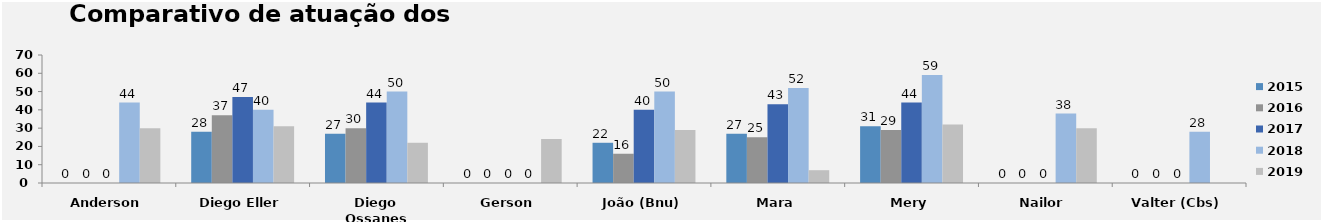
| Category | 2015 | 2016 | 2017 | 2018 | 2019 |
|---|---|---|---|---|---|
| Anderson | 0 | 0 | 0 | 44 | 30 |
| Diego Eller | 28 | 37 | 47 | 40 | 31 |
| Diego Ossanes | 27 | 30 | 44 | 50 | 22 |
| Gerson | 0 | 0 | 0 | 0 | 24 |
| João (Bnu) | 22 | 16 | 40 | 50 | 29 |
| Mara | 27 | 25 | 43 | 52 | 7 |
| Mery | 31 | 29 | 44 | 59 | 32 |
| Nailor | 0 | 0 | 0 | 38 | 30 |
| Valter (Cbs) | 0 | 0 | 0 | 28 | 0 |